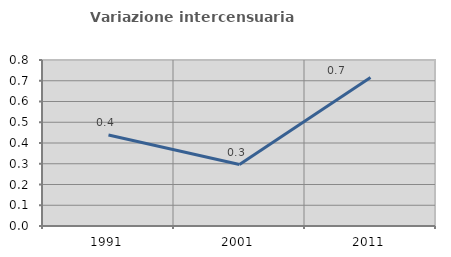
| Category | Variazione intercensuaria annua |
|---|---|
| 1991.0 | 0.438 |
| 2001.0 | 0.296 |
| 2011.0 | 0.716 |